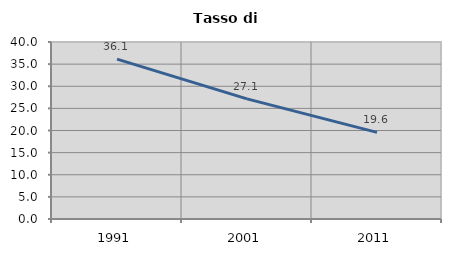
| Category | Tasso di disoccupazione   |
|---|---|
| 1991.0 | 36.127 |
| 2001.0 | 27.139 |
| 2011.0 | 19.583 |